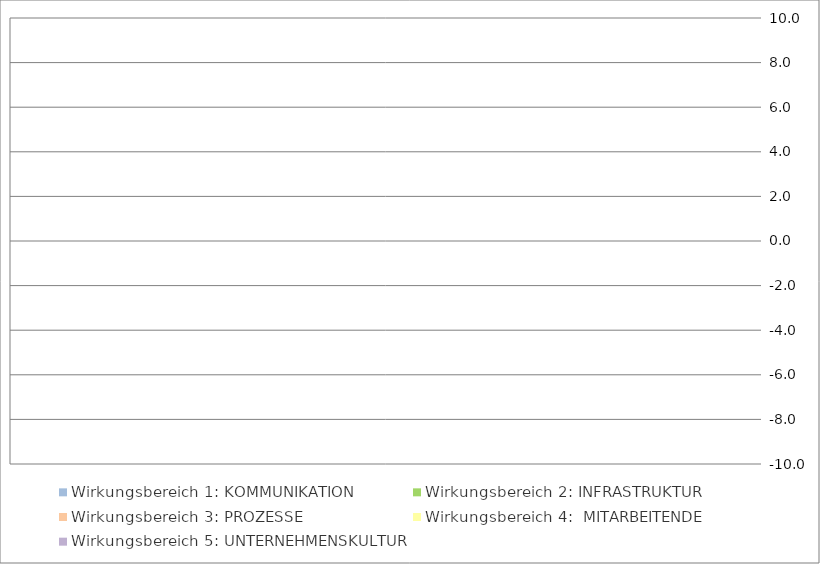
| Category | Wirkungsbereich 1: KOMMUNIKATION | Wirkungsbereich 2: INFRASTRUKTUR | Wirkungsbereich 3: PROZESSE | Wirkungsbereich 4:  MITARBEITENDE | Wirkungsbereich 5: UNTERNEHMENSKULTUR |
|---|---|---|---|---|---|
| 0 | 0 | 0 | 0 | 0 | 0 |